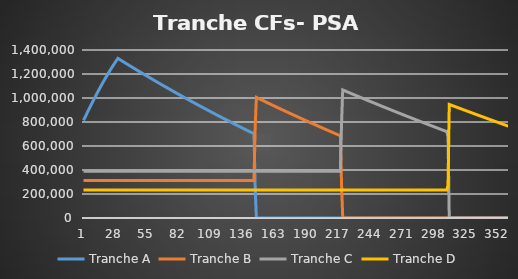
| Category | Tranche A | Tranche B | Tranche C | Tranche D |
|---|---|---|---|---|
| 0 | 813573.671 | 312500 | 390625 | 234375 |
| 1 | 834315.688 | 312500 | 390625 | 234375 |
| 2 | 854895.771 | 312500 | 390625 | 234375 |
| 3 | 875308.341 | 312500 | 390625 | 234375 |
| 4 | 895547.85 | 312500 | 390625 | 234375 |
| 5 | 915608.793 | 312500 | 390625 | 234375 |
| 6 | 935485.706 | 312500 | 390625 | 234375 |
| 7 | 955173.167 | 312500 | 390625 | 234375 |
| 8 | 974665.801 | 312500 | 390625 | 234375 |
| 9 | 993958.282 | 312500 | 390625 | 234375 |
| 10 | 1013045.336 | 312500 | 390625 | 234375 |
| 11 | 1031921.741 | 312500 | 390625 | 234375 |
| 12 | 1050582.331 | 312500 | 390625 | 234375 |
| 13 | 1069022 | 312500 | 390625 | 234375 |
| 14 | 1087235.7 | 312500 | 390625 | 234375 |
| 15 | 1105218.448 | 312500 | 390625 | 234375 |
| 16 | 1122965.325 | 312500 | 390625 | 234375 |
| 17 | 1140471.48 | 312500 | 390625 | 234375 |
| 18 | 1157732.131 | 312500 | 390625 | 234375 |
| 19 | 1174742.567 | 312500 | 390625 | 234375 |
| 20 | 1191498.153 | 312500 | 390625 | 234375 |
| 21 | 1207994.329 | 312500 | 390625 | 234375 |
| 22 | 1224226.614 | 312500 | 390625 | 234375 |
| 23 | 1240190.605 | 312500 | 390625 | 234375 |
| 24 | 1255881.984 | 312500 | 390625 | 234375 |
| 25 | 1271296.516 | 312500 | 390625 | 234375 |
| 26 | 1286430.053 | 312500 | 390625 | 234375 |
| 27 | 1301278.533 | 312500 | 390625 | 234375 |
| 28 | 1315837.986 | 312500 | 390625 | 234375 |
| 29 | 1330104.534 | 312500 | 390625 | 234375 |
| 30 | 1323938.421 | 312500 | 390625 | 234375 |
| 31 | 1317786.221 | 312500 | 390625 | 234375 |
| 32 | 1311647.892 | 312500 | 390625 | 234375 |
| 33 | 1305523.391 | 312500 | 390625 | 234375 |
| 34 | 1299412.677 | 312500 | 390625 | 234375 |
| 35 | 1293315.706 | 312500 | 390625 | 234375 |
| 36 | 1287232.438 | 312500 | 390625 | 234375 |
| 37 | 1281162.829 | 312500 | 390625 | 234375 |
| 38 | 1275106.839 | 312500 | 390625 | 234375 |
| 39 | 1269064.426 | 312500 | 390625 | 234375 |
| 40 | 1263035.547 | 312500 | 390625 | 234375 |
| 41 | 1257020.161 | 312500 | 390625 | 234375 |
| 42 | 1251018.226 | 312500 | 390625 | 234375 |
| 43 | 1245029.702 | 312500 | 390625 | 234375 |
| 44 | 1239054.546 | 312500 | 390625 | 234375 |
| 45 | 1233092.717 | 312500 | 390625 | 234375 |
| 46 | 1227144.175 | 312500 | 390625 | 234375 |
| 47 | 1221208.877 | 312500 | 390625 | 234375 |
| 48 | 1215286.782 | 312500 | 390625 | 234375 |
| 49 | 1209377.851 | 312500 | 390625 | 234375 |
| 50 | 1203482.04 | 312500 | 390625 | 234375 |
| 51 | 1197599.311 | 312500 | 390625 | 234375 |
| 52 | 1191729.621 | 312500 | 390625 | 234375 |
| 53 | 1185872.931 | 312500 | 390625 | 234375 |
| 54 | 1180029.198 | 312500 | 390625 | 234375 |
| 55 | 1174198.384 | 312500 | 390625 | 234375 |
| 56 | 1168380.447 | 312500 | 390625 | 234375 |
| 57 | 1162575.346 | 312500 | 390625 | 234375 |
| 58 | 1156783.042 | 312500 | 390625 | 234375 |
| 59 | 1151003.494 | 312500 | 390625 | 234375 |
| 60 | 1145236.661 | 312500 | 390625 | 234375 |
| 61 | 1139482.504 | 312500 | 390625 | 234375 |
| 62 | 1133740.983 | 312500 | 390625 | 234375 |
| 63 | 1128012.056 | 312500 | 390625 | 234375 |
| 64 | 1122295.685 | 312500 | 390625 | 234375 |
| 65 | 1116591.83 | 312500 | 390625 | 234375 |
| 66 | 1110900.45 | 312500 | 390625 | 234375 |
| 67 | 1105221.505 | 312500 | 390625 | 234375 |
| 68 | 1099554.957 | 312500 | 390625 | 234375 |
| 69 | 1093900.765 | 312500 | 390625 | 234375 |
| 70 | 1088258.89 | 312500 | 390625 | 234375 |
| 71 | 1082629.293 | 312500 | 390625 | 234375 |
| 72 | 1077011.933 | 312500 | 390625 | 234375 |
| 73 | 1071406.771 | 312500 | 390625 | 234375 |
| 74 | 1065813.768 | 312500 | 390625 | 234375 |
| 75 | 1060232.886 | 312500 | 390625 | 234375 |
| 76 | 1054664.084 | 312500 | 390625 | 234375 |
| 77 | 1049107.323 | 312500 | 390625 | 234375 |
| 78 | 1043562.565 | 312500 | 390625 | 234375 |
| 79 | 1038029.771 | 312500 | 390625 | 234375 |
| 80 | 1032508.9 | 312500 | 390625 | 234375 |
| 81 | 1026999.916 | 312500 | 390625 | 234375 |
| 82 | 1021502.778 | 312500 | 390625 | 234375 |
| 83 | 1016017.449 | 312500 | 390625 | 234375 |
| 84 | 1010543.888 | 312500 | 390625 | 234375 |
| 85 | 1005082.059 | 312500 | 390625 | 234375 |
| 86 | 999631.921 | 312500 | 390625 | 234375 |
| 87 | 994193.438 | 312500 | 390625 | 234375 |
| 88 | 988766.569 | 312500 | 390625 | 234375 |
| 89 | 983351.278 | 312500 | 390625 | 234375 |
| 90 | 977947.525 | 312500 | 390625 | 234375 |
| 91 | 972555.272 | 312500 | 390625 | 234375 |
| 92 | 967174.481 | 312500 | 390625 | 234375 |
| 93 | 961805.114 | 312500 | 390625 | 234375 |
| 94 | 956447.133 | 312500 | 390625 | 234375 |
| 95 | 951100.5 | 312500 | 390625 | 234375 |
| 96 | 945765.177 | 312500 | 390625 | 234375 |
| 97 | 940441.126 | 312500 | 390625 | 234375 |
| 98 | 935128.309 | 312500 | 390625 | 234375 |
| 99 | 929826.688 | 312500 | 390625 | 234375 |
| 100 | 924536.226 | 312500 | 390625 | 234375 |
| 101 | 919256.885 | 312500 | 390625 | 234375 |
| 102 | 913988.627 | 312500 | 390625 | 234375 |
| 103 | 908731.414 | 312500 | 390625 | 234375 |
| 104 | 903485.21 | 312500 | 390625 | 234375 |
| 105 | 898249.977 | 312500 | 390625 | 234375 |
| 106 | 893025.677 | 312500 | 390625 | 234375 |
| 107 | 887812.274 | 312500 | 390625 | 234375 |
| 108 | 882609.729 | 312500 | 390625 | 234375 |
| 109 | 877418.005 | 312500 | 390625 | 234375 |
| 110 | 872237.066 | 312500 | 390625 | 234375 |
| 111 | 867066.874 | 312500 | 390625 | 234375 |
| 112 | 861907.393 | 312500 | 390625 | 234375 |
| 113 | 856758.584 | 312500 | 390625 | 234375 |
| 114 | 851620.412 | 312500 | 390625 | 234375 |
| 115 | 846492.839 | 312500 | 390625 | 234375 |
| 116 | 841375.829 | 312500 | 390625 | 234375 |
| 117 | 836269.344 | 312500 | 390625 | 234375 |
| 118 | 831173.348 | 312500 | 390625 | 234375 |
| 119 | 826087.805 | 312500 | 390625 | 234375 |
| 120 | 821012.677 | 312500 | 390625 | 234375 |
| 121 | 815947.928 | 312500 | 390625 | 234375 |
| 122 | 810893.521 | 312500 | 390625 | 234375 |
| 123 | 805849.42 | 312500 | 390625 | 234375 |
| 124 | 800815.589 | 312500 | 390625 | 234375 |
| 125 | 795791.991 | 312500 | 390625 | 234375 |
| 126 | 790778.59 | 312500 | 390625 | 234375 |
| 127 | 785775.349 | 312500 | 390625 | 234375 |
| 128 | 780782.232 | 312500 | 390625 | 234375 |
| 129 | 775799.204 | 312500 | 390625 | 234375 |
| 130 | 770826.227 | 312500 | 390625 | 234375 |
| 131 | 765863.266 | 312500 | 390625 | 234375 |
| 132 | 760910.285 | 312500 | 390625 | 234375 |
| 133 | 755967.248 | 312500 | 390625 | 234375 |
| 134 | 751034.118 | 312500 | 390625 | 234375 |
| 135 | 746110.86 | 312500 | 390625 | 234375 |
| 136 | 741197.438 | 312500 | 390625 | 234375 |
| 137 | 736293.817 | 312500 | 390625 | 234375 |
| 138 | 731399.959 | 312500 | 390625 | 234375 |
| 139 | 726515.831 | 312500 | 390625 | 234375 |
| 140 | 721641.395 | 312500 | 390625 | 234375 |
| 141 | 716776.617 | 312500 | 390625 | 234375 |
| 142 | 711921.461 | 312500 | 390625 | 234375 |
| 143 | 707075.891 | 312500 | 390625 | 234375 |
| 144 | 702239.871 | 312500 | 390625 | 234375 |
| 145 | 256318.93 | 753594.437 | 390625 | 234375 |
| 146 | 0 | 1005096.343 | 390625 | 234375 |
| 147 | 0 | 1000288.763 | 390625 | 234375 |
| 148 | 0 | 995490.592 | 390625 | 234375 |
| 149 | 0 | 990701.795 | 390625 | 234375 |
| 150 | 0 | 985922.337 | 390625 | 234375 |
| 151 | 0 | 981152.183 | 390625 | 234375 |
| 152 | 0 | 976391.296 | 390625 | 234375 |
| 153 | 0 | 971639.643 | 390625 | 234375 |
| 154 | 0 | 966897.188 | 390625 | 234375 |
| 155 | 0 | 962163.896 | 390625 | 234375 |
| 156 | 0 | 957439.732 | 390625 | 234375 |
| 157 | 0 | 952724.661 | 390625 | 234375 |
| 158 | 0 | 948018.648 | 390625 | 234375 |
| 159 | 0 | 943321.659 | 390625 | 234375 |
| 160 | 0 | 938633.658 | 390625 | 234375 |
| 161 | 0 | 933954.61 | 390625 | 234375 |
| 162 | 0 | 929284.482 | 390625 | 234375 |
| 163 | 0 | 924623.238 | 390625 | 234375 |
| 164 | 0 | 919970.843 | 390625 | 234375 |
| 165 | 0 | 915327.264 | 390625 | 234375 |
| 166 | 0 | 910692.464 | 390625 | 234375 |
| 167 | 0 | 906066.411 | 390625 | 234375 |
| 168 | 0 | 901449.068 | 390625 | 234375 |
| 169 | 0 | 896840.402 | 390625 | 234375 |
| 170 | 0 | 892240.379 | 390625 | 234375 |
| 171 | 0 | 887648.963 | 390625 | 234375 |
| 172 | 0 | 883066.121 | 390625 | 234375 |
| 173 | 0 | 878491.817 | 390625 | 234375 |
| 174 | 0 | 873926.019 | 390625 | 234375 |
| 175 | 0 | 869368.691 | 390625 | 234375 |
| 176 | 0 | 864819.799 | 390625 | 234375 |
| 177 | 0 | 860279.31 | 390625 | 234375 |
| 178 | 0 | 855747.188 | 390625 | 234375 |
| 179 | 0 | 851223.4 | 390625 | 234375 |
| 180 | 0 | 846707.911 | 390625 | 234375 |
| 181 | 0 | 842200.688 | 390625 | 234375 |
| 182 | 0 | 837701.696 | 390625 | 234375 |
| 183 | 0 | 833210.902 | 390625 | 234375 |
| 184 | 0 | 828728.272 | 390625 | 234375 |
| 185 | 0 | 824253.771 | 390625 | 234375 |
| 186 | 0 | 819787.365 | 390625 | 234375 |
| 187 | 0 | 815329.022 | 390625 | 234375 |
| 188 | 0 | 810878.706 | 390625 | 234375 |
| 189 | 0 | 806436.384 | 390625 | 234375 |
| 190 | 0 | 802002.023 | 390625 | 234375 |
| 191 | 0 | 797575.588 | 390625 | 234375 |
| 192 | 0 | 793157.045 | 390625 | 234375 |
| 193 | 0 | 788746.362 | 390625 | 234375 |
| 194 | 0 | 784343.504 | 390625 | 234375 |
| 195 | 0 | 779948.438 | 390625 | 234375 |
| 196 | 0 | 775561.131 | 390625 | 234375 |
| 197 | 0 | 771181.547 | 390625 | 234375 |
| 198 | 0 | 766809.655 | 390625 | 234375 |
| 199 | 0 | 762445.42 | 390625 | 234375 |
| 200 | 0 | 758088.809 | 390625 | 234375 |
| 201 | 0 | 753739.788 | 390625 | 234375 |
| 202 | 0 | 749398.325 | 390625 | 234375 |
| 203 | 0 | 745064.385 | 390625 | 234375 |
| 204 | 0 | 740737.935 | 390625 | 234375 |
| 205 | 0 | 736418.942 | 390625 | 234375 |
| 206 | 0 | 732107.372 | 390625 | 234375 |
| 207 | 0 | 727803.193 | 390625 | 234375 |
| 208 | 0 | 723506.37 | 390625 | 234375 |
| 209 | 0 | 719216.871 | 390625 | 234375 |
| 210 | 0 | 714934.662 | 390625 | 234375 |
| 211 | 0 | 710659.711 | 390625 | 234375 |
| 212 | 0 | 706391.983 | 390625 | 234375 |
| 213 | 0 | 702131.446 | 390625 | 234375 |
| 214 | 0 | 697878.066 | 390625 | 234375 |
| 215 | 0 | 693631.811 | 390625 | 234375 |
| 216 | 0 | 689392.647 | 390625 | 234375 |
| 217 | 0 | 685160.541 | 390625 | 234375 |
| 218 | 0 | 279273.337 | 792287.123 | 234375 |
| 219 | 0 | 0 | 1067342.372 | 234375 |
| 220 | 0 | 0 | 1063131.242 | 234375 |
| 221 | 0 | 0 | 1058927.038 | 234375 |
| 222 | 0 | 0 | 1054729.728 | 234375 |
| 223 | 0 | 0 | 1050539.277 | 234375 |
| 224 | 0 | 0 | 1046355.654 | 234375 |
| 225 | 0 | 0 | 1042178.825 | 234375 |
| 226 | 0 | 0 | 1038008.757 | 234375 |
| 227 | 0 | 0 | 1033845.418 | 234375 |
| 228 | 0 | 0 | 1029688.774 | 234375 |
| 229 | 0 | 0 | 1025538.793 | 234375 |
| 230 | 0 | 0 | 1021395.442 | 234375 |
| 231 | 0 | 0 | 1017258.688 | 234375 |
| 232 | 0 | 0 | 1013128.498 | 234375 |
| 233 | 0 | 0 | 1009004.839 | 234375 |
| 234 | 0 | 0 | 1004887.679 | 234375 |
| 235 | 0 | 0 | 1000776.986 | 234375 |
| 236 | 0 | 0 | 996672.725 | 234375 |
| 237 | 0 | 0 | 992574.865 | 234375 |
| 238 | 0 | 0 | 988483.373 | 234375 |
| 239 | 0 | 0 | 984398.216 | 234375 |
| 240 | 0 | 0 | 980319.361 | 234375 |
| 241 | 0 | 0 | 976246.776 | 234375 |
| 242 | 0 | 0 | 972180.428 | 234375 |
| 243 | 0 | 0 | 968120.285 | 234375 |
| 244 | 0 | 0 | 964066.314 | 234375 |
| 245 | 0 | 0 | 960018.482 | 234375 |
| 246 | 0 | 0 | 955976.756 | 234375 |
| 247 | 0 | 0 | 951941.105 | 234375 |
| 248 | 0 | 0 | 947911.496 | 234375 |
| 249 | 0 | 0 | 943887.895 | 234375 |
| 250 | 0 | 0 | 939870.271 | 234375 |
| 251 | 0 | 0 | 935858.591 | 234375 |
| 252 | 0 | 0 | 931852.822 | 234375 |
| 253 | 0 | 0 | 927852.933 | 234375 |
| 254 | 0 | 0 | 923858.889 | 234375 |
| 255 | 0 | 0 | 919870.66 | 234375 |
| 256 | 0 | 0 | 915888.212 | 234375 |
| 257 | 0 | 0 | 911911.513 | 234375 |
| 258 | 0 | 0 | 907940.531 | 234375 |
| 259 | 0 | 0 | 903975.232 | 234375 |
| 260 | 0 | 0 | 900015.586 | 234375 |
| 261 | 0 | 0 | 896061.558 | 234375 |
| 262 | 0 | 0 | 892113.118 | 234375 |
| 263 | 0 | 0 | 888170.231 | 234375 |
| 264 | 0 | 0 | 884232.867 | 234375 |
| 265 | 0 | 0 | 880300.992 | 234375 |
| 266 | 0 | 0 | 876374.575 | 234375 |
| 267 | 0 | 0 | 872453.582 | 234375 |
| 268 | 0 | 0 | 868537.981 | 234375 |
| 269 | 0 | 0 | 864627.741 | 234375 |
| 270 | 0 | 0 | 860722.828 | 234375 |
| 271 | 0 | 0 | 856823.21 | 234375 |
| 272 | 0 | 0 | 852928.855 | 234375 |
| 273 | 0 | 0 | 849039.731 | 234375 |
| 274 | 0 | 0 | 845155.805 | 234375 |
| 275 | 0 | 0 | 841277.045 | 234375 |
| 276 | 0 | 0 | 837403.418 | 234375 |
| 277 | 0 | 0 | 833534.892 | 234375 |
| 278 | 0 | 0 | 829671.435 | 234375 |
| 279 | 0 | 0 | 825813.014 | 234375 |
| 280 | 0 | 0 | 821959.597 | 234375 |
| 281 | 0 | 0 | 818111.152 | 234375 |
| 282 | 0 | 0 | 814267.647 | 234375 |
| 283 | 0 | 0 | 810429.048 | 234375 |
| 284 | 0 | 0 | 806595.324 | 234375 |
| 285 | 0 | 0 | 802766.443 | 234375 |
| 286 | 0 | 0 | 798942.371 | 234375 |
| 287 | 0 | 0 | 795123.078 | 234375 |
| 288 | 0 | 0 | 791308.529 | 234375 |
| 289 | 0 | 0 | 787498.693 | 234375 |
| 290 | 0 | 0 | 783693.539 | 234375 |
| 291 | 0 | 0 | 779893.032 | 234375 |
| 292 | 0 | 0 | 776097.141 | 234375 |
| 293 | 0 | 0 | 772305.834 | 234375 |
| 294 | 0 | 0 | 768519.078 | 234375 |
| 295 | 0 | 0 | 764736.841 | 234375 |
| 296 | 0 | 0 | 760959.091 | 234375 |
| 297 | 0 | 0 | 757185.795 | 234375 |
| 298 | 0 | 0 | 753416.92 | 234375 |
| 299 | 0 | 0 | 749652.435 | 234375 |
| 300 | 0 | 0 | 745892.307 | 234375 |
| 301 | 0 | 0 | 742136.503 | 234375 |
| 302 | 0 | 0 | 738384.992 | 234375 |
| 303 | 0 | 0 | 734637.741 | 234375 |
| 304 | 0 | 0 | 730894.717 | 234375 |
| 305 | 0 | 0 | 727155.888 | 234375 |
| 306 | 0 | 0 | 723421.222 | 234375 |
| 307 | 0 | 0 | 719690.686 | 234375 |
| 308 | 0 | 0 | 674810.53 | 275528.717 |
| 309 | 0 | 0 | 0 | 946616.874 |
| 310 | 0 | 0 | 0 | 942898.534 |
| 311 | 0 | 0 | 0 | 939184.195 |
| 312 | 0 | 0 | 0 | 935473.823 |
| 313 | 0 | 0 | 0 | 931767.387 |
| 314 | 0 | 0 | 0 | 928064.854 |
| 315 | 0 | 0 | 0 | 924366.191 |
| 316 | 0 | 0 | 0 | 920671.366 |
| 317 | 0 | 0 | 0 | 916980.347 |
| 318 | 0 | 0 | 0 | 913293.101 |
| 319 | 0 | 0 | 0 | 909609.595 |
| 320 | 0 | 0 | 0 | 905929.797 |
| 321 | 0 | 0 | 0 | 902253.674 |
| 322 | 0 | 0 | 0 | 898581.194 |
| 323 | 0 | 0 | 0 | 894912.324 |
| 324 | 0 | 0 | 0 | 891247.031 |
| 325 | 0 | 0 | 0 | 887585.284 |
| 326 | 0 | 0 | 0 | 883927.049 |
| 327 | 0 | 0 | 0 | 880272.293 |
| 328 | 0 | 0 | 0 | 876620.984 |
| 329 | 0 | 0 | 0 | 872973.09 |
| 330 | 0 | 0 | 0 | 869328.577 |
| 331 | 0 | 0 | 0 | 865687.413 |
| 332 | 0 | 0 | 0 | 862049.565 |
| 333 | 0 | 0 | 0 | 858415 |
| 334 | 0 | 0 | 0 | 854783.686 |
| 335 | 0 | 0 | 0 | 851155.59 |
| 336 | 0 | 0 | 0 | 847530.68 |
| 337 | 0 | 0 | 0 | 843908.921 |
| 338 | 0 | 0 | 0 | 840290.282 |
| 339 | 0 | 0 | 0 | 836674.729 |
| 340 | 0 | 0 | 0 | 833062.23 |
| 341 | 0 | 0 | 0 | 829452.752 |
| 342 | 0 | 0 | 0 | 825846.261 |
| 343 | 0 | 0 | 0 | 822242.726 |
| 344 | 0 | 0 | 0 | 818642.113 |
| 345 | 0 | 0 | 0 | 815044.389 |
| 346 | 0 | 0 | 0 | 811449.52 |
| 347 | 0 | 0 | 0 | 807857.475 |
| 348 | 0 | 0 | 0 | 804268.22 |
| 349 | 0 | 0 | 0 | 800681.722 |
| 350 | 0 | 0 | 0 | 797097.947 |
| 351 | 0 | 0 | 0 | 793516.864 |
| 352 | 0 | 0 | 0 | 789938.438 |
| 353 | 0 | 0 | 0 | 786362.636 |
| 354 | 0 | 0 | 0 | 782789.426 |
| 355 | 0 | 0 | 0 | 779218.773 |
| 356 | 0 | 0 | 0 | 775650.646 |
| 357 | 0 | 0 | 0 | 772085.01 |
| 358 | 0 | 0 | 0 | 768521.833 |
| 359 | 0 | 0 | 0 | 764961.08 |